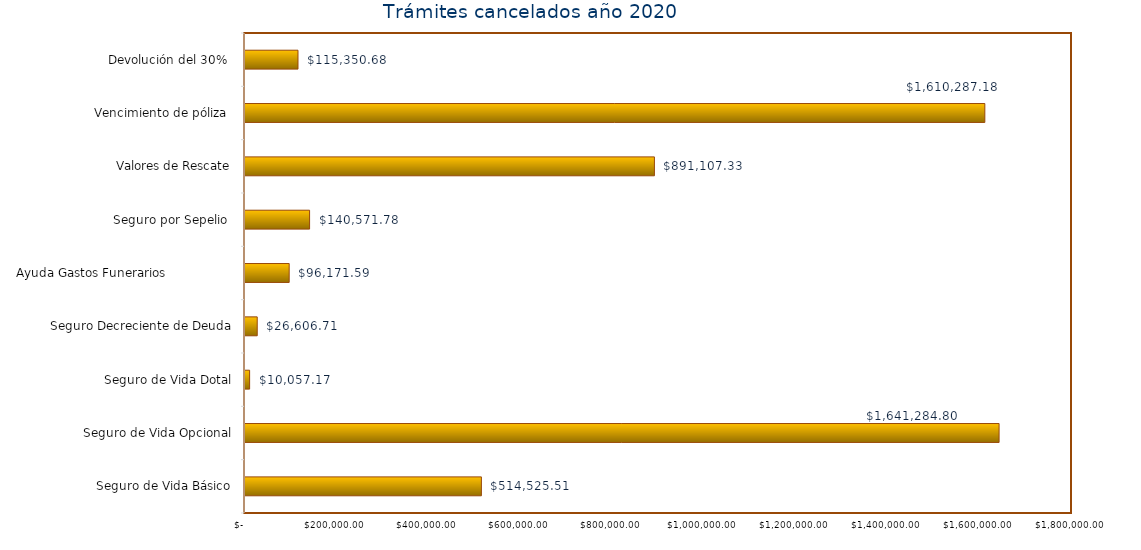
| Category | Monto  |
|---|---|
| Seguro de Vida Básico | 514525.51 |
| Seguro de Vida Opcional | 1641284.8 |
| Seguro de Vida Dotal | 10057.17 |
| Seguro Decreciente de Deuda | 26606.71 |
| Ayuda Gastos Funerarios                  | 96171.59 |
| Seguro por Sepelio  | 140571.78 |
| Valores de Rescate | 891107.33 |
| Vencimiento de póliza  | 1610287.18 |
| Devolución del 30%  | 115350.68 |